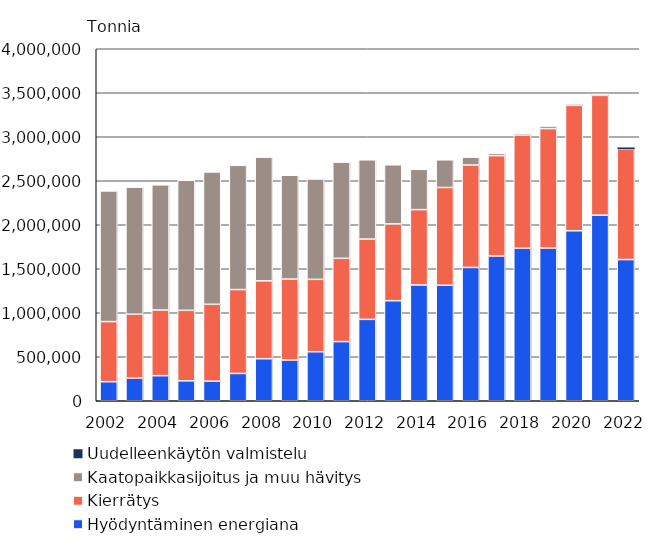
| Category | Hyödyntäminen energiana | Kierrätys | Kaatopaikkasijoitus ja muu hävitys | Uudelleenkäytön valmistelu |
|---|---|---|---|---|
| 2002.0 | 216314 | 683543 | 1484559 | 0 |
| 2003.0 | 256311 | 726671 | 1444541 | 0 |
| 2004.0 | 284895 | 745852 | 1422692 | 0 |
| 2005.0 | 226843 | 800784 | 1478123 | 0 |
| 2006.0 | 222323 | 873878 | 1503910 | 0 |
| 2007.0 | 310350 | 953274 | 1411294 | 0 |
| 2008.0 | 477794 | 884304 | 1406105 | 0 |
| 2009.0 | 462750 | 919830 | 1179840 | 0 |
| 2010.0 | 557131 | 822152 | 1140721 | 0 |
| 2011.0 | 672209 | 946234 | 1093277 | 0 |
| 2012.0 | 924825 | 912596 | 900674 | 0 |
| 2013.0 | 1136939 | 872210 | 672398 | 0 |
| 2014.0 | 1315820 | 856326 | 457733 | 0 |
| 2015.0 | 1312180 | 1111338 | 314762 | 0 |
| 2016.0 | 1514830 | 1163566 | 89535 | 0 |
| 2017.0 | 1645554 | 1140133 | 25902 | 0 |
| 2018.0 | 1732450 | 1285711 | 21949 | 0 |
| 2019.0 | 1735109 | 1357227 | 29669 | 0 |
| 2020.0 | 1931974 | 1424280 | 18016 | 0 |
| 2021.0 | 2109565 | 1360524 | 14499 | 0 |
| 2022.0 | 1604394 | 1257747 | 10660 | 8295 |